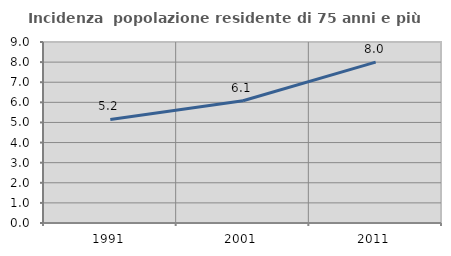
| Category | Incidenza  popolazione residente di 75 anni e più |
|---|---|
| 1991.0 | 5.152 |
| 2001.0 | 6.081 |
| 2011.0 | 8.002 |